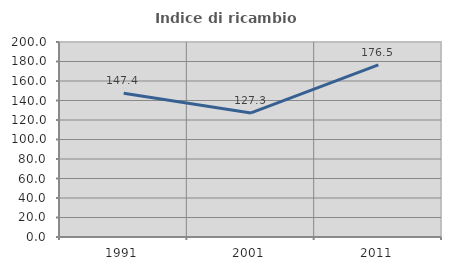
| Category | Indice di ricambio occupazionale  |
|---|---|
| 1991.0 | 147.368 |
| 2001.0 | 127.273 |
| 2011.0 | 176.471 |